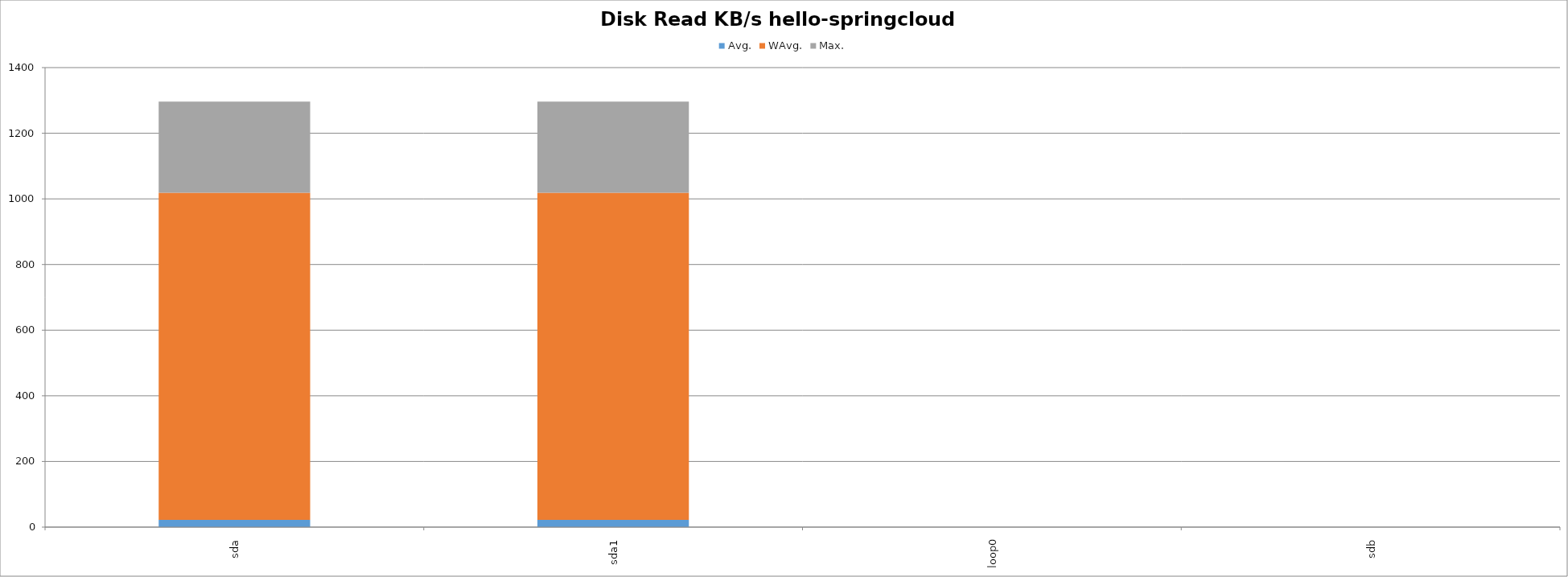
| Category | Avg. | WAvg. | Max. |
|---|---|---|---|
| sda | 22.292 | 996.219 | 277.688 |
| sda1 | 22.292 | 996.219 | 277.688 |
| loop0 | 0 | 0 | 0 |
| sdb | 0 | 0 | 0 |